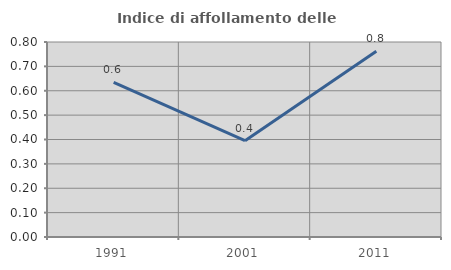
| Category | Indice di affollamento delle abitazioni  |
|---|---|
| 1991.0 | 0.634 |
| 2001.0 | 0.395 |
| 2011.0 | 0.762 |